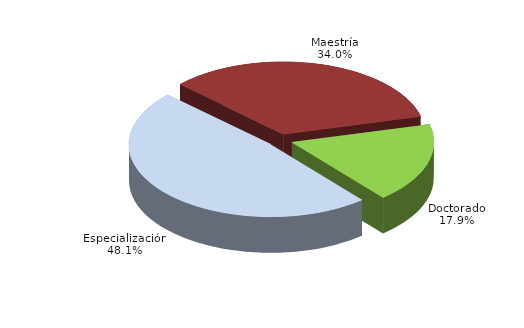
| Category | Series 0 |
|---|---|
| Especialización | 14594 |
| Maestría | 10297 |
| Doctorado | 5419 |